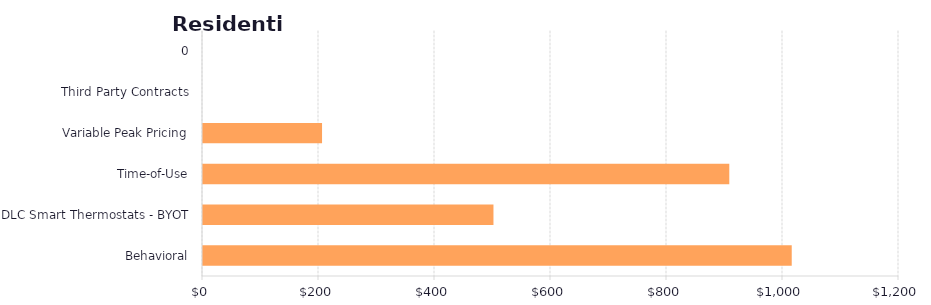
| Category | Series 1 |
|---|---|
| Behavioral | 1015.055 |
| DLC Smart Thermostats - BYOT | 500.797 |
| Time-of-Use | 907.405 |
| Variable Peak Pricing | 205.248 |
| Third Party Contracts | 0 |
| 0 | 0 |